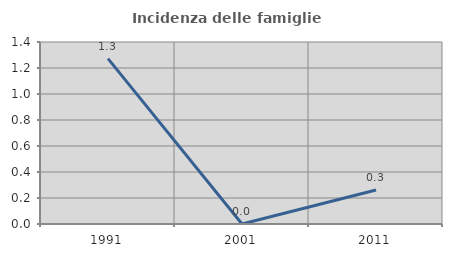
| Category | Incidenza delle famiglie numerose |
|---|---|
| 1991.0 | 1.272 |
| 2001.0 | 0 |
| 2011.0 | 0.262 |